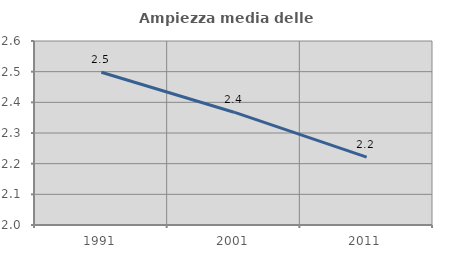
| Category | Ampiezza media delle famiglie |
|---|---|
| 1991.0 | 2.498 |
| 2001.0 | 2.368 |
| 2011.0 | 2.221 |